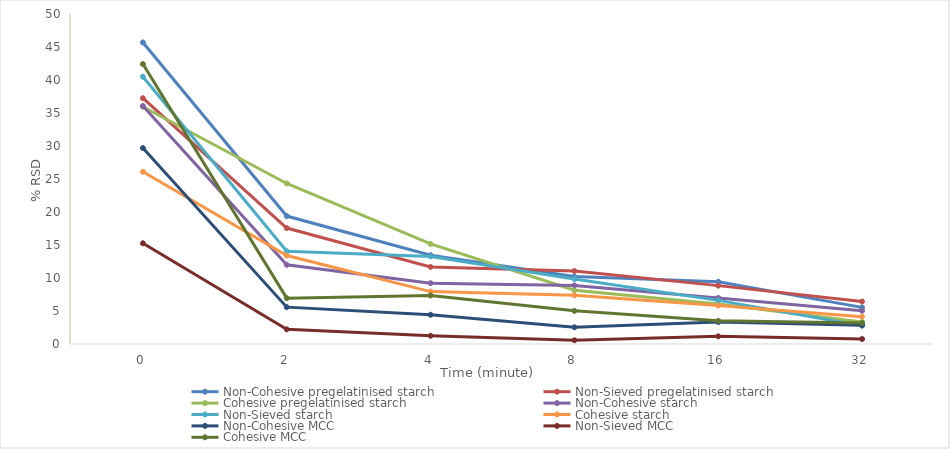
| Category | Non-Cohesive pregelatinised starch | Non-Sieved pregelatinised starch | Cohesive pregelatinised starch | Non-Cohesive starch | Non-Sieved starch | Cohesive starch | Non-Cohesive MCC | Non-Sieved MCC | Cohesive MCC |
|---|---|---|---|---|---|---|---|---|---|
| 0.0 | 45.693 | 37.241 | 35.95 | 36.05 | 40.5 | 26.1 | 29.684 | 15.264 | 42.416 |
| 2.0 | 19.385 | 17.57 | 24.32 | 12 | 14.05 | 13.4 | 5.585 | 2.222 | 6.95 |
| 4.0 | 13.458 | 11.684 | 15.16 | 9.22 | 13.27 | 7.94 | 4.427 | 1.248 | 7.35 |
| 8.0 | 10.235 | 11.062 | 8.138 | 8.88 | 9.86 | 7.38 | 2.53 | 0.561 | 5.027 |
| 16.0 | 9.437 | 8.844 | 6.057 | 6.983 | 6.612 | 5.83 | 3.33 | 1.158 | 3.507 |
| 32.0 | 5.548 | 6.436 | 3.34 | 5.03 | 2.77 | 4.13 | 2.831 | 0.754 | 3.177 |